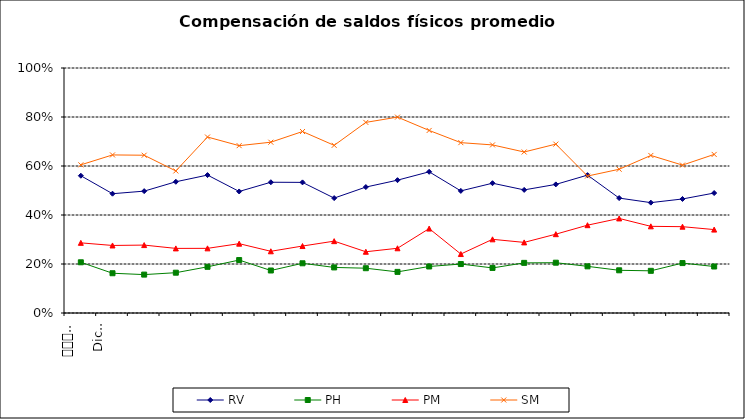
| Category | RV | PH | PM | SM |
|---|---|---|---|---|
| 0 | 0.56 | 0.207 | 0.286 | 0.605 |
| 1 | 0.487 | 0.162 | 0.276 | 0.645 |
| 2 | 0.497 | 0.157 | 0.277 | 0.644 |
| 3 | 0.536 | 0.164 | 0.264 | 0.58 |
| 4 | 0.563 | 0.188 | 0.264 | 0.718 |
| 5 | 0.496 | 0.216 | 0.283 | 0.683 |
| 6 | 0.534 | 0.174 | 0.252 | 0.697 |
| 7 | 0.533 | 0.203 | 0.273 | 0.741 |
| 8 | 0.469 | 0.186 | 0.293 | 0.684 |
| 9 | 0.514 | 0.183 | 0.25 | 0.778 |
| 10 | 0.542 | 0.168 | 0.264 | 0.8 |
| 11 | 0.576 | 0.19 | 0.345 | 0.745 |
| 12 | 0.498 | 0.2 | 0.241 | 0.695 |
| 13 | 0.53 | 0.184 | 0.301 | 0.686 |
| 14 | 0.502 | 0.205 | 0.288 | 0.657 |
| 15 | 0.525 | 0.205 | 0.322 | 0.689 |
| 16 | 0.563 | 0.19 | 0.358 | 0.559 |
| 17 | 0.469 | 0.174 | 0.386 | 0.587 |
| 18 | 0.45 | 0.172 | 0.354 | 0.643 |
| 19 | 0.465 | 0.204 | 0.352 | 0.604 |
| 20 | 0.49 | 0.19 | 0.34 | 0.647 |